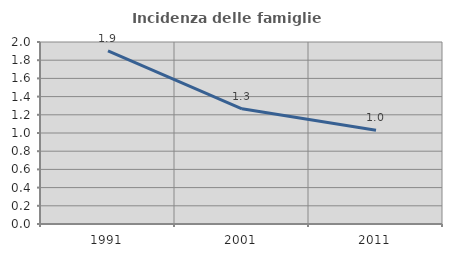
| Category | Incidenza delle famiglie numerose |
|---|---|
| 1991.0 | 1.903 |
| 2001.0 | 1.265 |
| 2011.0 | 1.03 |